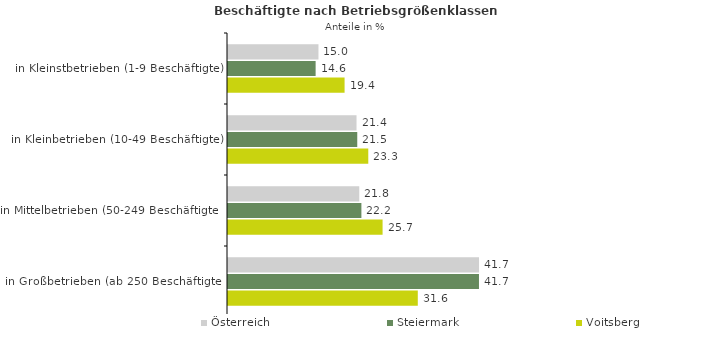
| Category | Österreich | Steiermark | Voitsberg |
|---|---|---|---|
| in Kleinstbetrieben (1-9 Beschäftigte) | 15.046 | 14.574 | 19.39 |
| in Kleinbetrieben (10-49 Beschäftigte) | 21.375 | 21.498 | 23.331 |
| in Mittelbetrieben (50-249 Beschäftigte) | 21.831 | 22.187 | 25.71 |
| in Großbetrieben (ab 250 Beschäftigte) | 41.748 | 41.742 | 31.566 |